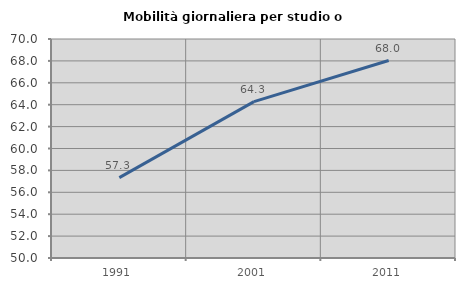
| Category | Mobilità giornaliera per studio o lavoro |
|---|---|
| 1991.0 | 57.337 |
| 2001.0 | 64.281 |
| 2011.0 | 68.032 |